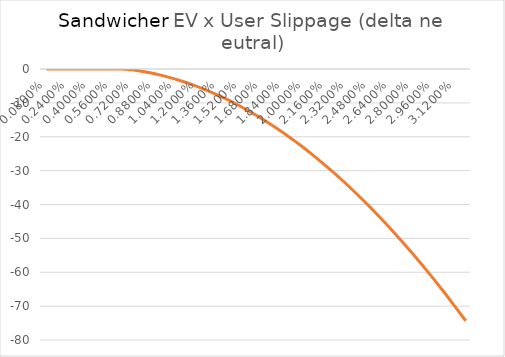
| Category | Searcher EV / User Volume  x User Slippage |
|---|---|
| 0.0008 | 0 |
| 0.0016 | 0 |
| 0.0024000000000000002 | 0 |
| 0.0032 | 0 |
| 0.004 | 0 |
| 0.0048000000000000004 | 0 |
| 0.005600000000000001 | 0 |
| 0.006400000000000001 | 0 |
| 0.0072000000000000015 | -0.219 |
| 0.008000000000000002 | -0.716 |
| 0.008800000000000002 | -1.341 |
| 0.009600000000000003 | -2.093 |
| 0.010400000000000003 | -2.972 |
| 0.011200000000000003 | -3.979 |
| 0.012000000000000004 | -5.112 |
| 0.012800000000000004 | -6.373 |
| 0.013600000000000004 | -7.76 |
| 0.014400000000000005 | -9.274 |
| 0.015200000000000005 | -10.914 |
| 0.016000000000000004 | -12.681 |
| 0.016800000000000002 | -14.574 |
| 0.0176 | -16.592 |
| 0.0184 | -18.737 |
| 0.0192 | -21.007 |
| 0.019999999999999997 | -23.403 |
| 0.020799999999999996 | -25.925 |
| 0.021599999999999994 | -28.571 |
| 0.022399999999999993 | -31.343 |
| 0.02319999999999999 | -34.24 |
| 0.02399999999999999 | -37.261 |
| 0.02479999999999999 | -40.408 |
| 0.025599999999999987 | -43.679 |
| 0.026399999999999986 | -47.074 |
| 0.027199999999999985 | -50.594 |
| 0.027999999999999983 | -54.237 |
| 0.028799999999999982 | -58.005 |
| 0.02959999999999998 | -61.896 |
| 0.03039999999999998 | -65.912 |
| 0.031199999999999978 | -70.05 |
| 0.03199999999999998 | -74.313 |